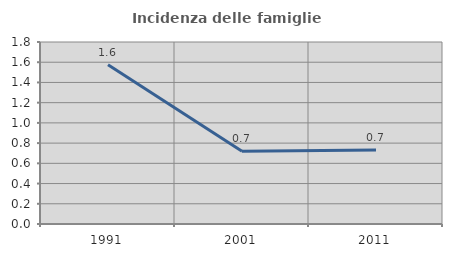
| Category | Incidenza delle famiglie numerose |
|---|---|
| 1991.0 | 1.576 |
| 2001.0 | 0.72 |
| 2011.0 | 0.733 |